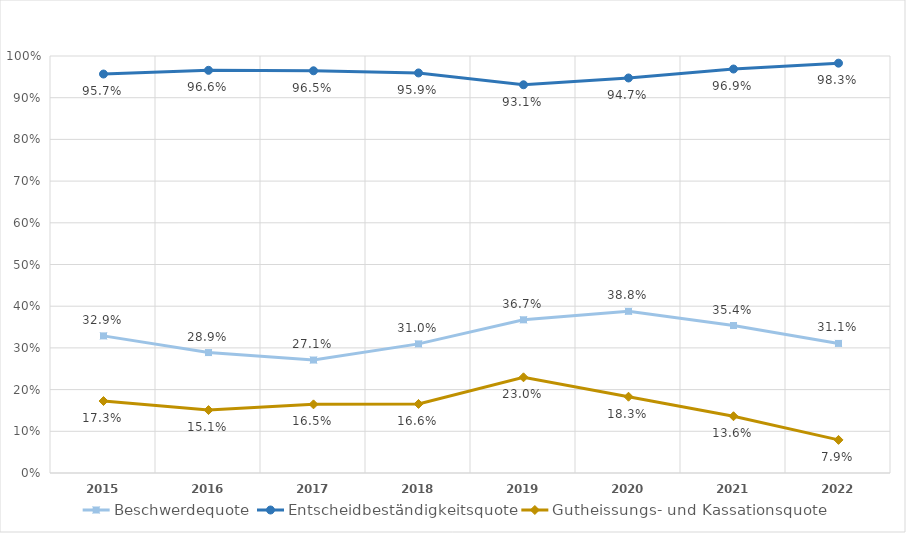
| Category | Beschwerdequote | Entscheidbeständigkeitsquote | Gutheissungs- und Kassationsquote |
|---|---|---|---|
| 2015.0 | 0.329 | 0.957 | 0.173 |
| 2016.0 | 0.289 | 0.966 | 0.151 |
| 2017.0 | 0.271 | 0.965 | 0.165 |
| 2018.0 | 0.31 | 0.959 | 0.166 |
| 2019.0 | 0.367 | 0.931 | 0.23 |
| 2020.0 | 0.388 | 0.947 | 0.183 |
| 2021.0 | 0.354 | 0.969 | 0.136 |
| 2022.0 | 0.311 | 0.983 | 0.079 |